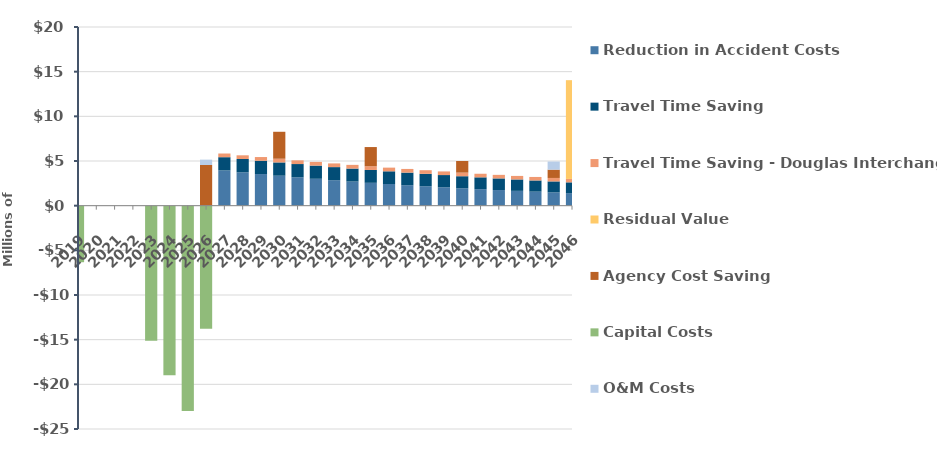
| Category | Reduction in Accident Costs  | Travel Time Saving  | Travel Time Saving - Douglas Interchange | Residual Value | Agency Cost Saving | Capital Costs | O&M Costs |
|---|---|---|---|---|---|---|---|
| 2019.0 | 0 | 0 | 0 | 0 | 0 | -6329734.948 | 0 |
| 2020.0 | 0 | 0 | 0 | 0 | 0 | 0 | 0 |
| 2021.0 | 0 | 0 | 0 | 0 | 0 | 0 | 0 |
| 2022.0 | 0 | 0 | 0 | 0 | 0 | 0 | 0 |
| 2023.0 | 0 | 0 | 0 | 0 | 0 | -15113277.223 | 0 |
| 2024.0 | 0 | 0 | 0 | 0 | 0 | -18996358.646 | 0 |
| 2025.0 | 0 | 0 | 0 | 0 | 0 | -22973019.297 | 0 |
| 2026.0 | 0 | 0 | 0 | 0 | 4552958.769 | -13766025.997 | 599073.522 |
| 2027.0 | 3946707.747 | 1479467.019 | 412557.325 | 0 | 0 | 0 | 0 |
| 2028.0 | 3738431.264 | 1485384.33 | 413402.535 | 0 | 0 | 0 | 0 |
| 2029.0 | 3541145.992 | 1487555.118 | 414047.651 | 0 | 0 | 0 | 0 |
| 2030.0 | 3354271.898 | 1486316.387 | 414482.482 | 0 | 3016400.124 | 0 | 0 |
| 2031.0 | 3177259.564 | 1481981.765 | 414696.457 | 0 | 0 | 0 | 0 |
| 2032.0 | 3009588.561 | 1474842.959 | 414678.619 | 0 | 0 | 0 | 0 |
| 2033.0 | 2850765.927 | 1465171.128 | 414417.606 | 0 | 0 | 0 | 0 |
| 2034.0 | 2700324.714 | 1453218.169 | 413901.644 | 0 | 0 | 0 | 0 |
| 2035.0 | 2557822.616 | 1439217.931 | 413118.527 | 0 | 2150651.6 | 0 | 0 |
| 2036.0 | 2422840.669 | 1423387.353 | 412055.608 | 0 | 0 | 0 | 0 |
| 2037.0 | 2294982.017 | 1405927.544 | 410699.784 | 0 | 0 | 0 | 0 |
| 2038.0 | 2173870.748 | 1387024.786 | 409037.479 | 0 | 0 | 0 | 0 |
| 2039.0 | 2059150.789 | 1366851.489 | 407054.631 | 0 | 0 | 0 | 0 |
| 2040.0 | 1950484.855 | 1345567.081 | 404736.674 | 0 | 1301053.827 | 0 | 0 |
| 2041.0 | 1847553.462 | 1323318.848 | 402068.526 | 0 | 0 | 0 | 0 |
| 2042.0 | 1750053.986 | 1300242.727 | 399034.568 | 0 | 0 | 0 | 0 |
| 2043.0 | 1657699.773 | 1276464.041 | 395618.627 | 0 | 0 | 0 | 0 |
| 2044.0 | 1570219.296 | 1252098.202 | 391803.964 | 0 | 0 | 0 | 0 |
| 2045.0 | 1487355.356 | 1227251.365 | 387573.249 | 0 | 927633.397 | 0 | 911068.515 |
| 2046.0 | 1408864.33 | 1202021.039 | 382908.545 | 11054342.985 | 0 | 0 | 0 |